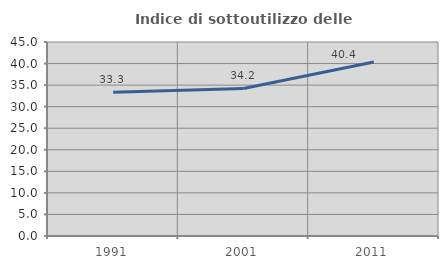
| Category | Indice di sottoutilizzo delle abitazioni  |
|---|---|
| 1991.0 | 33.333 |
| 2001.0 | 34.221 |
| 2011.0 | 40.365 |